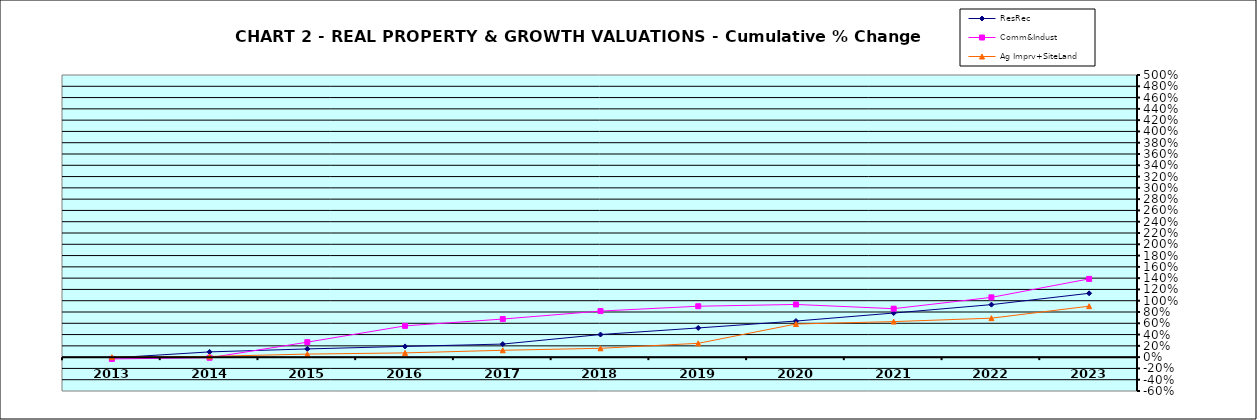
| Category | ResRec | Comm&Indust | Ag Imprv+SiteLand |
|---|---|---|---|
| 2013.0 | -0.014 | -0.031 | 0 |
| 2014.0 | 0.093 | -0.011 | 0.013 |
| 2015.0 | 0.146 | 0.266 | 0.054 |
| 2016.0 | 0.19 | 0.554 | 0.075 |
| 2017.0 | 0.232 | 0.675 | 0.122 |
| 2018.0 | 0.401 | 0.817 | 0.157 |
| 2019.0 | 0.517 | 0.902 | 0.245 |
| 2020.0 | 0.639 | 0.934 | 0.587 |
| 2021.0 | 0.782 | 0.859 | 0.63 |
| 2022.0 | 0.93 | 1.059 | 0.691 |
| 2023.0 | 1.131 | 1.387 | 0.903 |